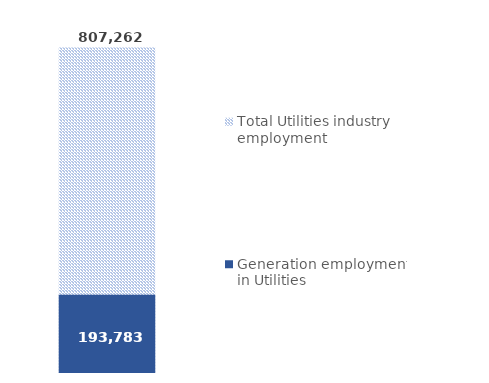
| Category | Total Utilities industry employment | Generation employment in Utilities |
|---|---|---|
| Utilities | 807262 | 193783 |